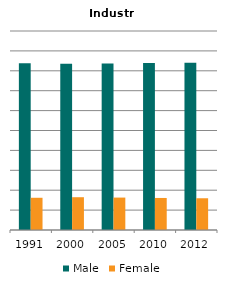
| Category | Male | Female |
|---|---|---|
| 1991.0 | 0.838 | 0.162 |
| 2000.0 | 0.835 | 0.165 |
| 2005.0 | 0.837 | 0.163 |
| 2010.0 | 0.839 | 0.161 |
| 2012.0 | 0.84 | 0.16 |